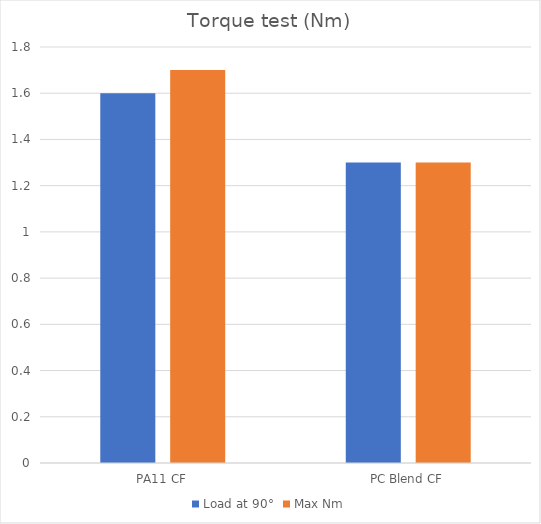
| Category | Load at 90° | Max Nm |
|---|---|---|
| PA11 CF | 1.6 | 1.7 |
| PC Blend CF | 1.3 | 1.3 |